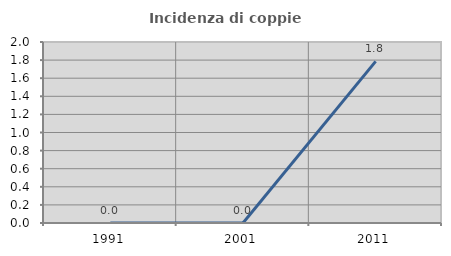
| Category | Incidenza di coppie miste |
|---|---|
| 1991.0 | 0 |
| 2001.0 | 0 |
| 2011.0 | 1.786 |